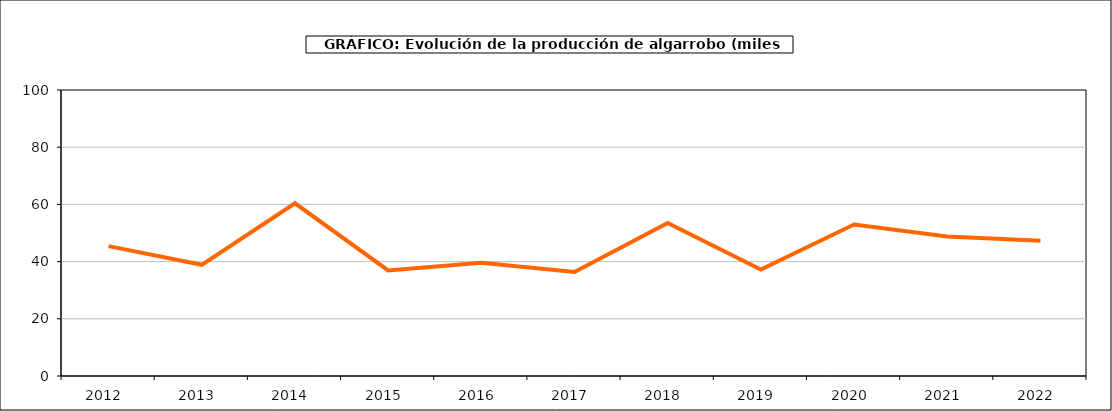
| Category | producción |
|---|---|
| 2012.0 | 45.414 |
| 2013.0 | 38.882 |
| 2014.0 | 60.4 |
| 2015.0 | 36.894 |
| 2016.0 | 39.587 |
| 2017.0 | 36.368 |
| 2018.0 | 53.477 |
| 2019.0 | 37.246 |
| 2020.0 | 52.989 |
| 2021.0 | 48.756 |
| 2022.0 | 47.286 |